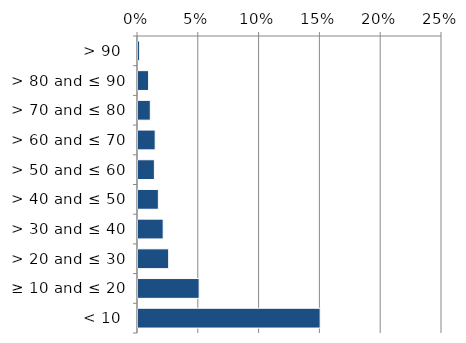
| Category | Native |
|---|---|
| < 10 | 0.151 |
| ≥ 10 and ≤ 20 | 0.051 |
| > 20 and ≤ 30 | 0.026 |
| > 30 and ≤ 40 | 0.022 |
| > 40 and ≤ 50 | 0.018 |
| > 50 and ≤ 60 | 0.014 |
| > 60 and ≤ 70 | 0.015 |
| > 70 and ≤ 80 | 0.011 |
| > 80 and ≤ 90 | 0.01 |
| > 90 | 0.002 |